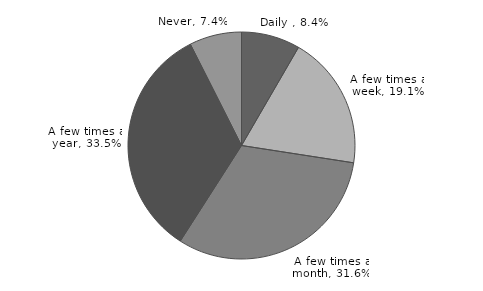
| Category | Series 0 |
|---|---|
| Daily  | 0.084 |
| A few times a week | 0.191 |
| A few times a month | 0.316 |
| A few times a year | 0.335 |
| Never | 0.074 |